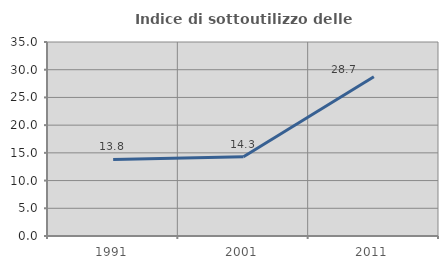
| Category | Indice di sottoutilizzo delle abitazioni  |
|---|---|
| 1991.0 | 13.805 |
| 2001.0 | 14.311 |
| 2011.0 | 28.731 |